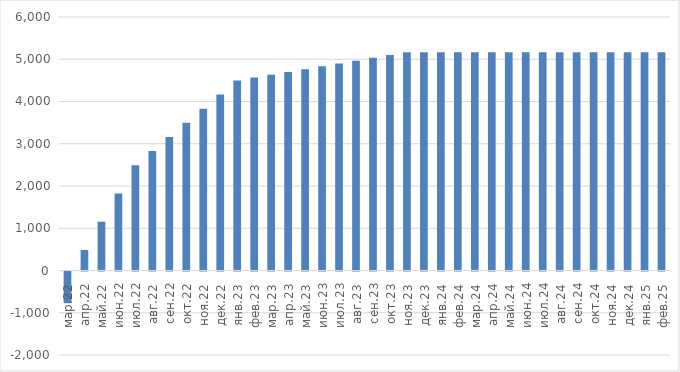
| Category | EBITDA |
|---|---|
| мар.22 | -750 |
| апр.22 | 486.1 |
| май.22 | 1154.8 |
| июн.22 | 1823.5 |
| июл.22 | 2492.2 |
| авг.22 | 2826.55 |
| сен.22 | 3160.9 |
| окт.22 | 3495.25 |
| ноя.22 | 3829.6 |
| дек.22 | 4163.95 |
| янв.23 | 4498.3 |
| фев.23 | 4565.17 |
| мар.23 | 4632.04 |
| апр.23 | 4698.91 |
| май.23 | 4765.78 |
| июн.23 | 4832.65 |
| июл.23 | 4899.52 |
| авг.23 | 4966.39 |
| сен.23 | 5033.26 |
| окт.23 | 5100.13 |
| ноя.23 | 5167 |
| дек.23 | 5167 |
| янв.24 | 5167 |
| фев.24 | 5167 |
| мар.24 | 5167 |
| апр.24 | 5167 |
| май.24 | 5167 |
| июн.24 | 5167 |
| июл.24 | 5167 |
| авг.24 | 5167 |
| сен.24 | 5167 |
| окт.24 | 5167 |
| ноя.24 | 5167 |
| дек.24 | 5167 |
| янв.25 | 5167 |
| фев.25 | 5167 |